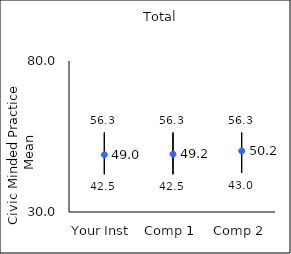
| Category | 25th percentile | 75th percentile | Mean |
|---|---|---|---|
| Your Inst | 42.5 | 56.3 | 48.96 |
| Comp 1 | 42.5 | 56.3 | 49.17 |
| Comp 2 | 43 | 56.3 | 50.21 |